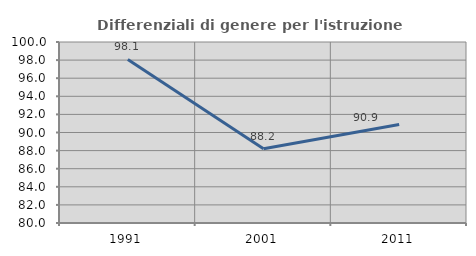
| Category | Differenziali di genere per l'istruzione superiore |
|---|---|
| 1991.0 | 98.069 |
| 2001.0 | 88.21 |
| 2011.0 | 90.892 |